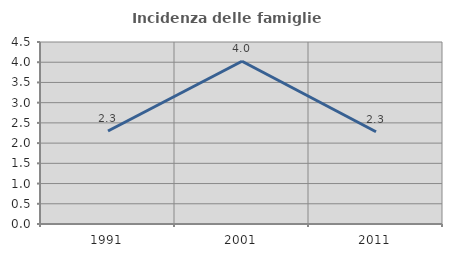
| Category | Incidenza delle famiglie numerose |
|---|---|
| 1991.0 | 2.3 |
| 2001.0 | 4.024 |
| 2011.0 | 2.28 |